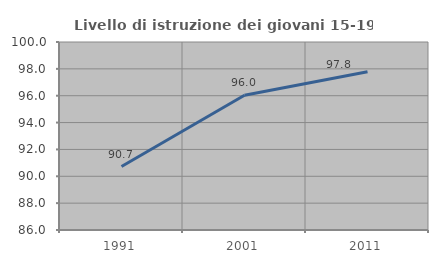
| Category | Livello di istruzione dei giovani 15-19 anni |
|---|---|
| 1991.0 | 90.727 |
| 2001.0 | 96.032 |
| 2011.0 | 97.79 |